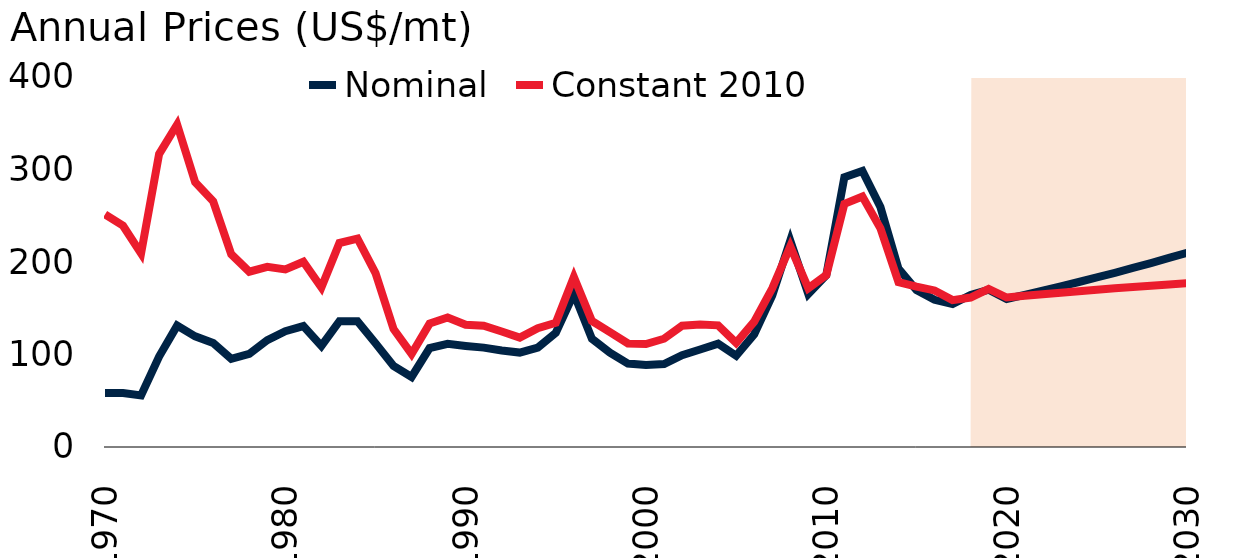
| Category | Nominal | Constant 2010 |
|---|---|---|
| 1970.0 | 58.4 | 251.566 |
| 1971.0 | 58.4 | 239.201 |
| 1972.0 | 55.752 | 209.339 |
| 1973.0 | 97.822 | 316.712 |
| 1974.0 | 131.226 | 348.635 |
| 1975.0 | 119.635 | 286.189 |
| 1976.0 | 112.372 | 265.554 |
| 1977.0 | 95.35 | 208.45 |
| 1978.0 | 100.742 | 189.516 |
| 1979.0 | 115.522 | 194.815 |
| 1980.0 | 125.262 | 192.049 |
| 1981.0 | 130.781 | 200.28 |
| 1982.0 | 109.262 | 172.464 |
| 1983.0 | 136.017 | 220.542 |
| 1984.0 | 135.942 | 225.382 |
| 1985.0 | 112.233 | 188.035 |
| 1986.0 | 87.558 | 127.542 |
| 1987.0 | 75.697 | 100.62 |
| 1988.0 | 106.891 | 133.425 |
| 1989.0 | 111.524 | 140.047 |
| 1990.0 | 109.276 | 132.179 |
| 1991.0 | 107.42 | 131.141 |
| 1992.0 | 104.246 | 124.93 |
| 1993.0 | 102.09 | 118.266 |
| 1994.0 | 107.55 | 128.449 |
| 1995.0 | 123.488 | 134.342 |
| 1996.0 | 165.809 | 183.888 |
| 1997.0 | 117.092 | 136.276 |
| 1998.0 | 101.987 | 124.115 |
| 1999.0 | 90.217 | 111.943 |
| 2000.0 | 88.534 | 111.28 |
| 2001.0 | 89.641 | 117.06 |
| 2002.0 | 99.271 | 131.167 |
| 2003.0 | 105.37 | 132.345 |
| 2004.0 | 111.803 | 131.493 |
| 2005.0 | 98.672 | 112.505 |
| 2006.0 | 121.851 | 135.501 |
| 2007.0 | 163.665 | 171.503 |
| 2008.0 | 223.117 | 216.968 |
| 2009.0 | 165.51 | 171.58 |
| 2010.0 | 185.914 | 185.914 |
| 2011.0 | 291.684 | 262.789 |
| 2012.0 | 298.417 | 270.857 |
| 2013.0 | 259.389 | 236.465 |
| 2014.0 | 192.881 | 178.235 |
| 2015.0 | 169.75 | 173.466 |
| 2016.0 | 159.161 | 169.259 |
| 2017.0 | 154.532 | 158.785 |
| 2018.0 | 164.415 | 161.54 |
| 2019.0 | 170.07 | 170.962 |
| 2020.0 | 160 | 161.633 |
| 2021.0 | 164.411 | 163.477 |
| 2022.0 | 168.943 | 165.215 |
| 2023.0 | 173.6 | 166.875 |
| 2024.0 | 178.386 | 168.471 |
| 2025.0 | 183.303 | 170.015 |
| 2026.0 | 188.356 | 171.513 |
| 2027.0 | 193.548 | 172.97 |
| 2028.0 | 198.884 | 174.39 |
| 2029.0 | 204.366 | 175.775 |
| 2030.0 | 210 | 177.126 |